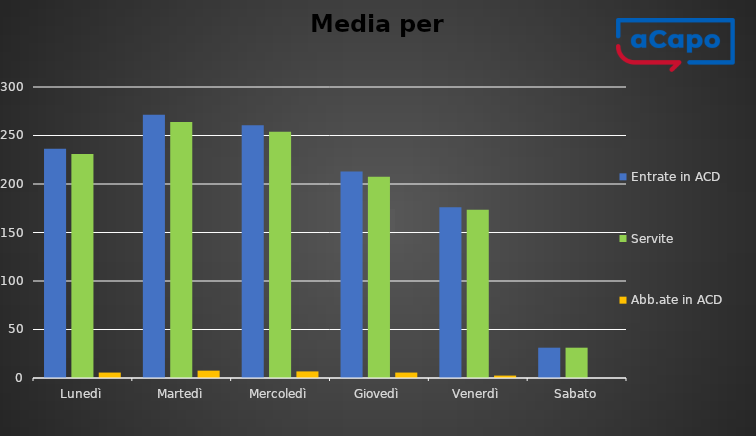
| Category | Entrate in ACD | Servite | Abb.ate in ACD |
|---|---|---|---|
| Lunedì | 236.4 | 230.8 | 5.6 |
| Martedì | 271.4 | 263.8 | 7.6 |
| Mercoledì | 260.6 | 253.8 | 6.8 |
| Giovedì | 213 | 207.4 | 5.6 |
| Venerdì | 176 | 173.5 | 2.5 |
| Sabato | 31.25 | 31.25 | 0 |